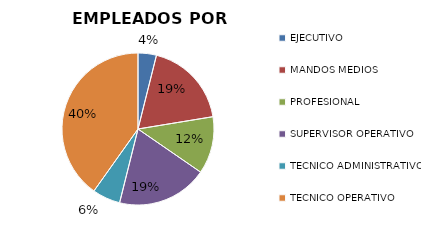
| Category | Series 0 |
|---|---|
| EJECUTIVO | 109 |
| MANDOS MEDIOS | 516 |
| PROFESIONAL | 340 |
| SUPERVISOR OPERATIVO | 538 |
| TECNICO ADMINISTRATIVO | 166 |
| TECNICO OPERATIVO | 1120 |